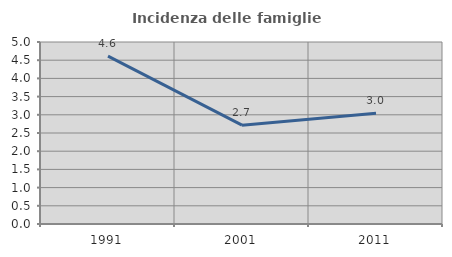
| Category | Incidenza delle famiglie numerose |
|---|---|
| 1991.0 | 4.614 |
| 2001.0 | 2.715 |
| 2011.0 | 3.041 |